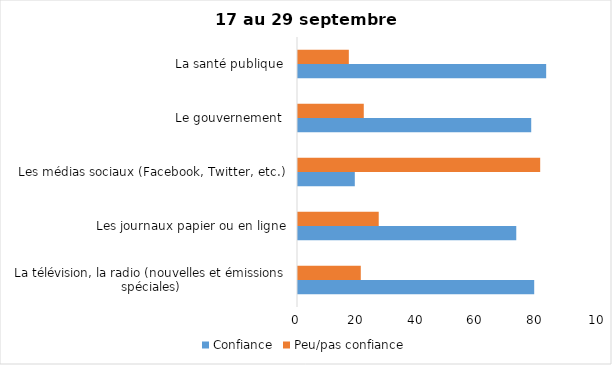
| Category | Confiance | Peu/pas confiance |
|---|---|---|
| La télévision, la radio (nouvelles et émissions spéciales) | 79 | 21 |
| Les journaux papier ou en ligne | 73 | 27 |
| Les médias sociaux (Facebook, Twitter, etc.) | 19 | 81 |
| Le gouvernement  | 78 | 22 |
| La santé publique  | 83 | 17 |